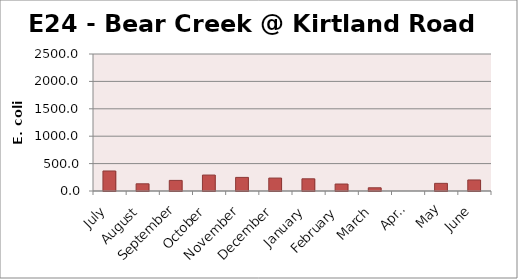
| Category | E. coli MPN |
|---|---|
| July | 365.4 |
| August | 131.3 |
| September | 193.5 |
| October | 290.9 |
| November | 248.1 |
| December | 235.9 |
| January | 222.4 |
| February | 127.4 |
| March | 58.6 |
| April | 0 |
| May | 139.6 |
| June | 201.4 |